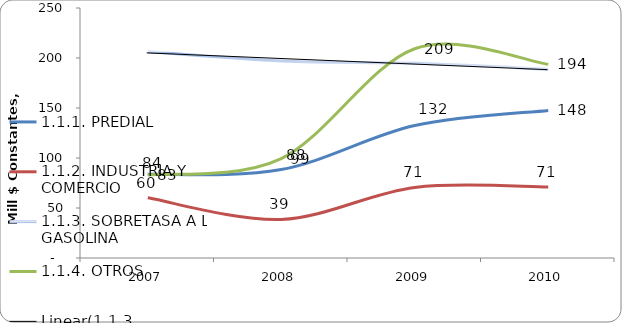
| Category | 1.1.1. PREDIAL | 1.1.2. INDUSTRIA Y COMERCIO | 1.1.3. SOBRETASA A LA GASOLINA | 1.1.4. OTROS |
|---|---|---|---|---|
| 2007 | 83.639 | 60.158 | 206.483 | 82.923 |
| 2008 | 88.437 | 38.559 | 197.041 | 99.378 |
| 2009 | 132.45 | 70.588 | 194.673 | 209.282 |
| 2010 | 147.577 | 70.961 | 188.711 | 193.66 |